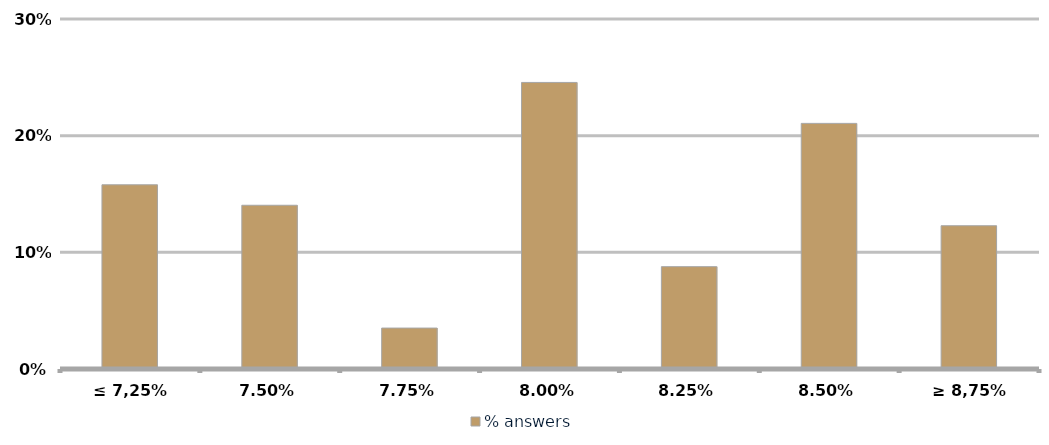
| Category | % answers |
|---|---|
| ≤ 7,25% | 0.158 |
| 7,50% | 0.14 |
| 7,75% | 0.035 |
| 8,00% | 0.246 |
| 8,25% | 0.088 |
| 8,50% | 0.211 |
| ≥ 8,75% | 0.123 |